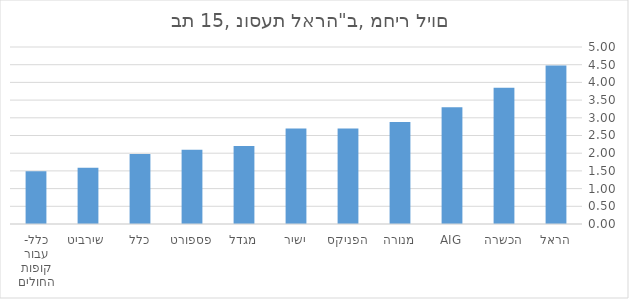
| Category | תכנית בסיס |
|---|---|
| הראל | 4.48 |
| הכשרה | 3.85 |
| AIG | 3.3 |
| מנורה | 2.882 |
| הפניקס | 2.7 |
| ישיר | 2.7 |
| מגדל | 2.2 |
| פספורט | 2.1 |
| כלל | 1.98 |
| שירביט  | 1.59 |
| כלל- עבור קופות החולים | 1.487 |